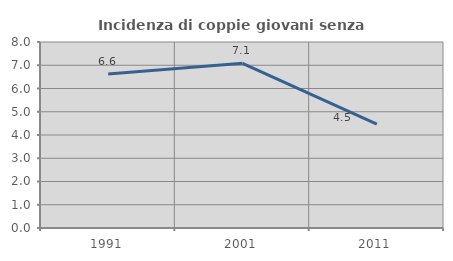
| Category | Incidenza di coppie giovani senza figli |
|---|---|
| 1991.0 | 6.626 |
| 2001.0 | 7.083 |
| 2011.0 | 4.467 |